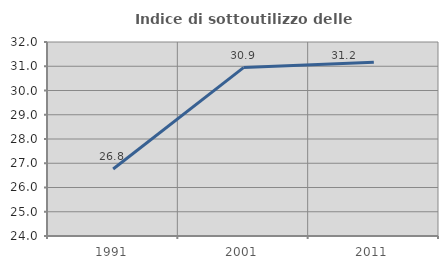
| Category | Indice di sottoutilizzo delle abitazioni  |
|---|---|
| 1991.0 | 26.762 |
| 2001.0 | 30.944 |
| 2011.0 | 31.169 |